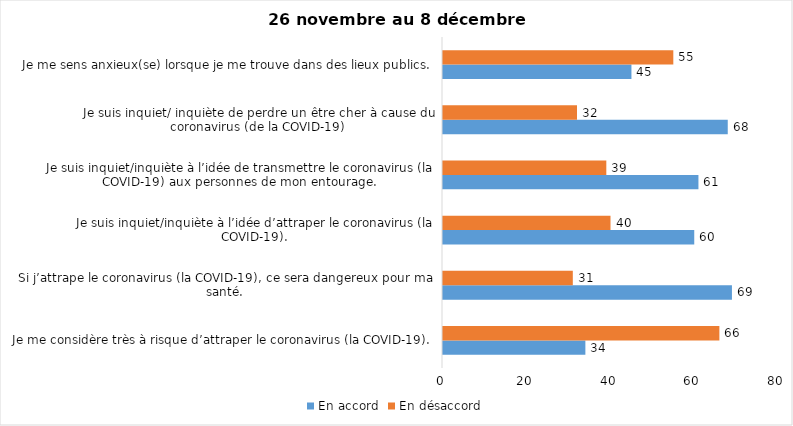
| Category | En accord | En désaccord |
|---|---|---|
| Je me considère très à risque d’attraper le coronavirus (la COVID-19). | 34 | 66 |
| Si j’attrape le coronavirus (la COVID-19), ce sera dangereux pour ma santé. | 69 | 31 |
| Je suis inquiet/inquiète à l’idée d’attraper le coronavirus (la COVID-19). | 60 | 40 |
| Je suis inquiet/inquiète à l’idée de transmettre le coronavirus (la COVID-19) aux personnes de mon entourage. | 61 | 39 |
| Je suis inquiet/ inquiète de perdre un être cher à cause du coronavirus (de la COVID-19) | 68 | 32 |
| Je me sens anxieux(se) lorsque je me trouve dans des lieux publics. | 45 | 55 |